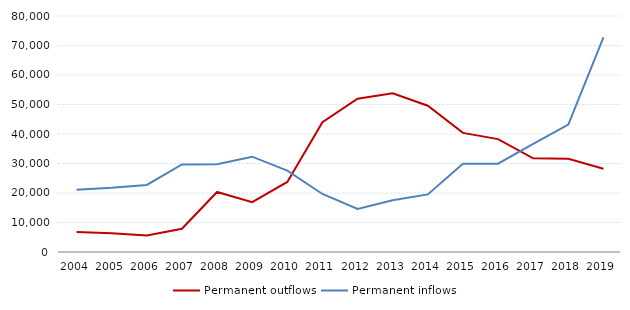
| Category | Permanent outflows | Permanent inflows |
|---|---|---|
| 2004.0 | 6757 | 21093 |
| 2005.0 | 6360 | 21741 |
| 2006.0 | 5600 | 22741 |
| 2007.0 | 7890 | 29661 |
| 2008.0 | 20357 | 29718 |
| 2009.0 | 16899 | 32307 |
| 2010.0 | 23760 | 27575 |
| 2011.0 | 43998 | 19667 |
| 2012.0 | 51958 | 14606 |
| 2013.0 | 53786 | 17554 |
| 2014.0 | 49572 | 19516 |
| 2015.0 | 40377 | 29896 |
| 2016.0 | 38273 | 29925 |
| 2017.0 | 31753 | 36639 |
| 2018.0 | 31600 | 43170 |
| 2019.0 | 28219 | 72725 |